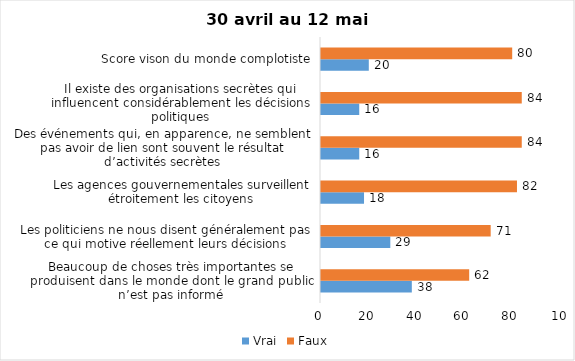
| Category | Vrai | Faux |
|---|---|---|
| Beaucoup de choses très importantes se produisent dans le monde dont le grand public n’est pas informé | 38 | 62 |
| Les politiciens ne nous disent généralement pas ce qui motive réellement leurs décisions | 29 | 71 |
| Les agences gouvernementales surveillent étroitement les citoyens | 18 | 82 |
| Des événements qui, en apparence, ne semblent pas avoir de lien sont souvent le résultat d’activités secrètes | 16 | 84 |
| Il existe des organisations secrètes qui influencent considérablement les décisions politiques | 16 | 84 |
| Score vison du monde complotiste | 20 | 80 |